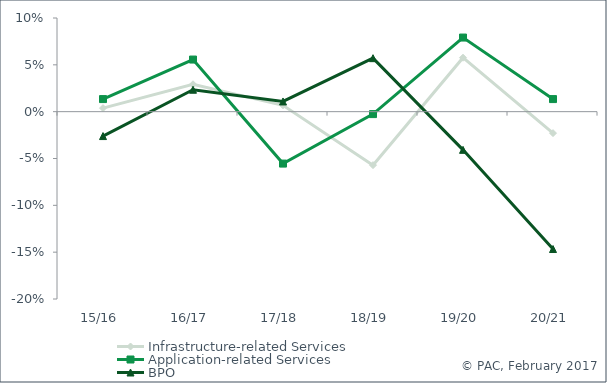
| Category | Infrastructure-related Services | Application-related Services | BPO |
|---|---|---|---|
| 15/16 | 0.004 | 0.013 | -0.026 |
| 16/17 | 0.029 | 0.056 | 0.023 |
| 17/18 | 0.007 | -0.055 | 0.011 |
| 18/19 | -0.057 | -0.003 | 0.057 |
| 19/20 | 0.058 | 0.079 | -0.041 |
| 20/21 | -0.023 | 0.013 | -0.147 |